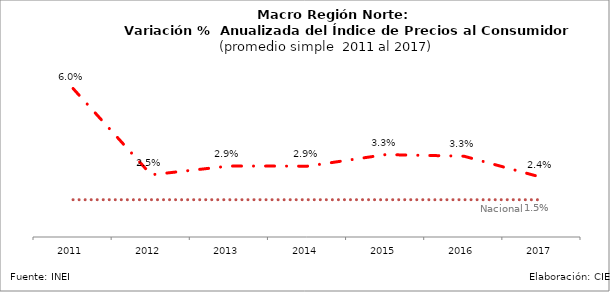
| Category | Series 0 | Nacional |
|---|---|---|
| 2011.0 | 0.06 | 0.015 |
| 2012.0 | 0.025 | 0.015 |
| 2013.0 | 0.029 | 0.015 |
| 2014.0 | 0.029 | 0.015 |
| 2015.0 | 0.033 | 0.015 |
| 2016.0 | 0.033 | 0.015 |
| 2017.0 | 0.024 | 0.015 |